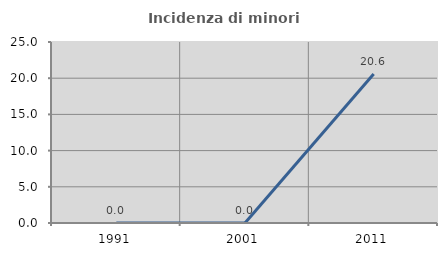
| Category | Incidenza di minori stranieri |
|---|---|
| 1991.0 | 0 |
| 2001.0 | 0 |
| 2011.0 | 20.588 |